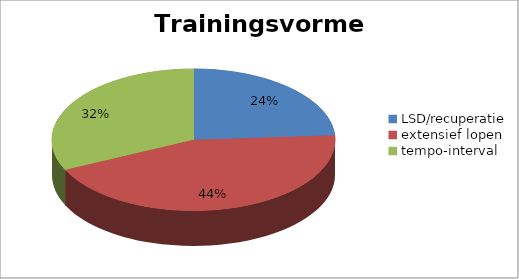
| Category | Series 0 |
|---|---|
| LSD/recuperatie | 60 |
| extensief lopen | 110 |
| tempo-interval | 80 |